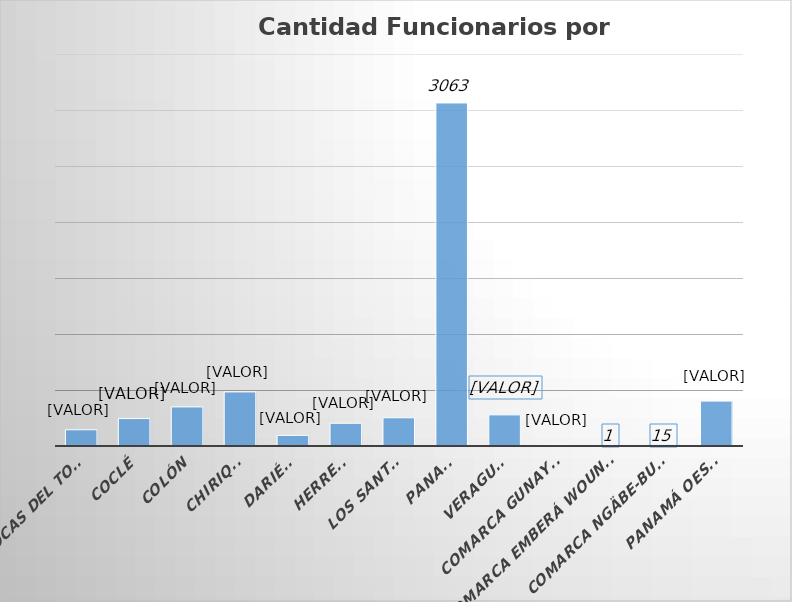
| Category | Cantidad  |
|---|---|
| BOCAS DEL TORO | 145 |
| COCLÉ | 245 |
| COLÓN | 349 |
| CHIRIQUÍ | 483 |
| DARIÉN | 95 |
| HERRERA | 203 |
| LOS SANTOS | 252 |
| PANAMÁ | 3063 |
| VERAGUAS | 278 |
| COMARCA GUNAYALA | 8 |
| COMARCA EMBERÁ WOUNAAN | 1 |
| COMARCA NGÄBE-BUGLÉ | 15 |
| PANAMÁ OESTE | 401 |